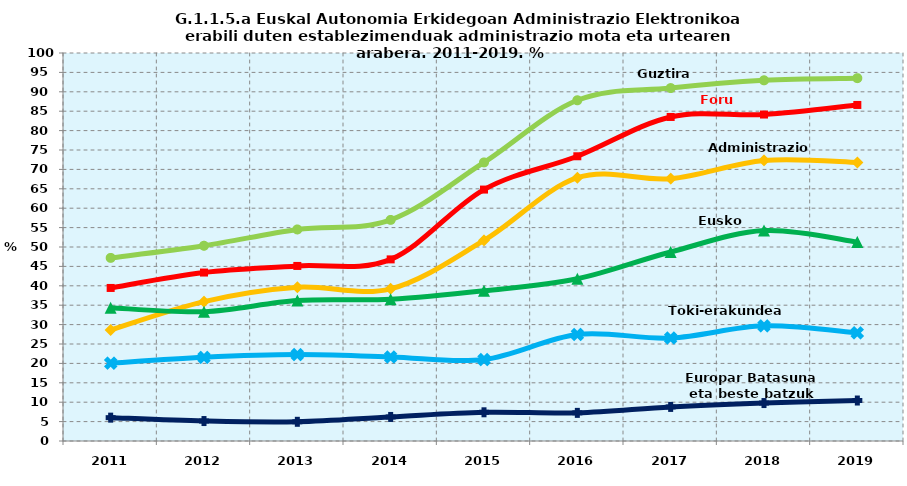
| Category | Guztira | Foru aldundiak | Administrazio Zentrala | Eusko Jaurlaritza | Toki-erakundeak | Europar Batasuna eta beste batzuk |
|---|---|---|---|---|---|---|
| 2011.0 | 47.195 | 39.446 | 28.619 | 34.347 | 20.063 | 6.017 |
| 2012.0 | 50.321 | 43.417 | 35.926 | 33.339 | 21.568 | 5.144 |
| 2013.0 | 54.524 | 45.118 | 39.622 | 36.207 | 22.264 | 4.948 |
| 2014.0 | 56.986 | 46.807 | 39.221 | 36.539 | 21.658 | 6.198 |
| 2015.0 | 71.8 | 64.8 | 51.7 | 38.7 | 21 | 7.4 |
| 2016.0 | 87.813 | 73.385 | 67.853 | 41.82 | 27.461 | 7.249 |
| 2017.0 | 90.959 | 83.514 | 67.612 | 48.718 | 26.543 | 8.784 |
| 2018.0 | 92.961 | 84.142 | 72.311 | 54.229 | 29.694 | 9.782 |
| 2019.0 | 93.517 | 86.609 | 71.787 | 51.305 | 27.87 | 10.432 |